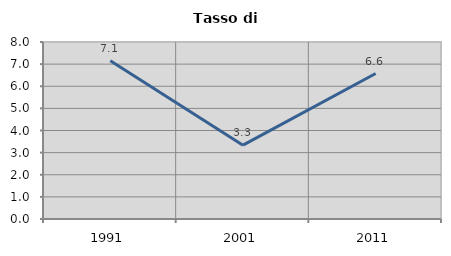
| Category | Tasso di disoccupazione   |
|---|---|
| 1991.0 | 7.15 |
| 2001.0 | 3.337 |
| 2011.0 | 6.576 |